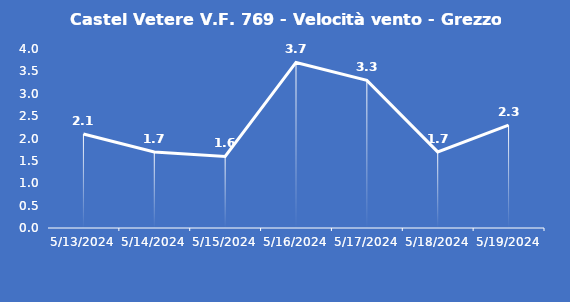
| Category | Castel Vetere V.F. 769 - Velocità vento - Grezzo (m/s) |
|---|---|
| 5/13/24 | 2.1 |
| 5/14/24 | 1.7 |
| 5/15/24 | 1.6 |
| 5/16/24 | 3.7 |
| 5/17/24 | 3.3 |
| 5/18/24 | 1.7 |
| 5/19/24 | 2.3 |